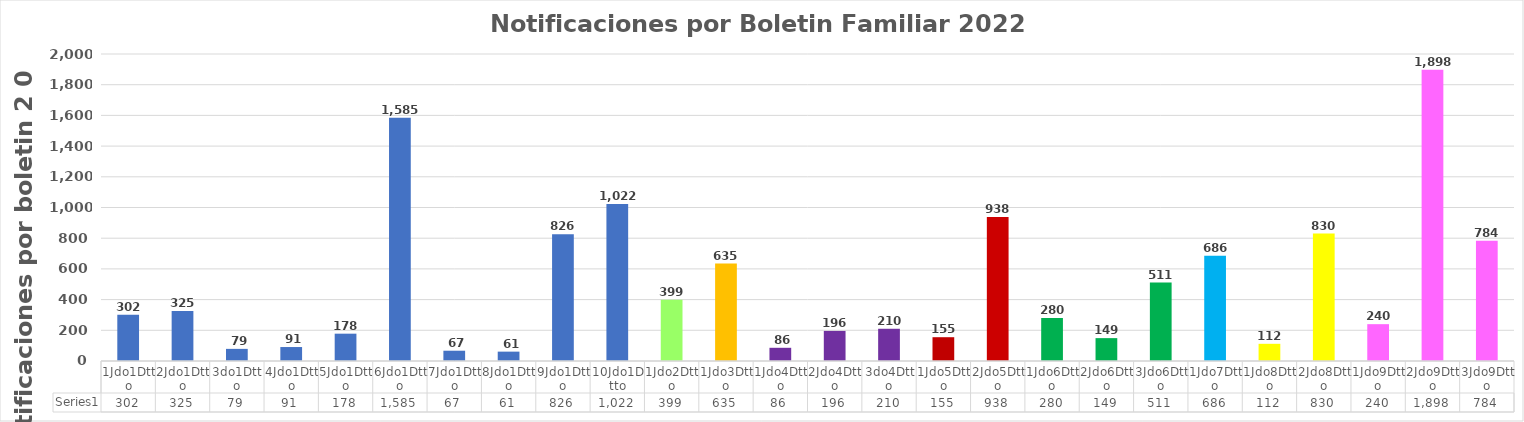
| Category | Series 0 |
|---|---|
| 1Jdo1Dtto | 302 |
| 2Jdo1Dtto | 325 |
| 3do1Dtto | 79 |
| 4Jdo1Dtto | 91 |
| 5Jdo1Dtto | 178 |
| 6Jdo1Dtto | 1585 |
| 7Jdo1Dtto | 67 |
| 8Jdo1Dtto | 61 |
| 9Jdo1Dtto | 826 |
| 10Jdo1Dtto | 1022 |
| 1Jdo2Dtto | 399 |
| 1Jdo3Dtto | 635 |
| 1Jdo4Dtto | 86 |
| 2Jdo4Dtto | 196 |
| 3do4Dtto | 210 |
| 1Jdo5Dtto | 155 |
| 2Jdo5Dtto | 938 |
| 1Jdo6Dtto | 280 |
| 2Jdo6Dtto | 149 |
| 3Jdo6Dtto | 511 |
| 1Jdo7Dtto | 686 |
| 1Jdo8Dtto | 112 |
| 2Jdo8Dtto | 830 |
| 1Jdo9Dtto | 240 |
| 2Jdo9Dtto | 1898 |
| 3Jdo9Dtto | 784 |